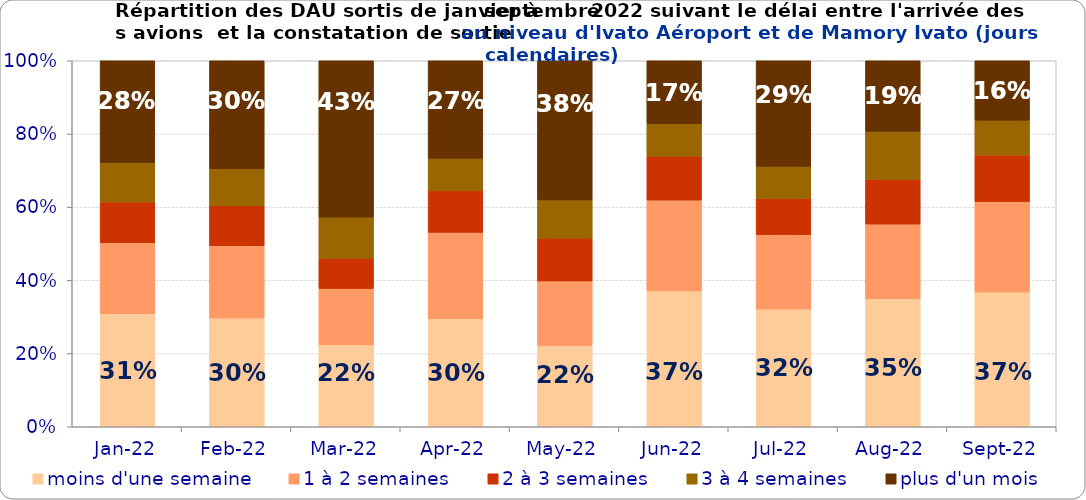
| Category | moins d'une semaine | 1 à 2 semaines | 2 à 3 semaines | 3 à 4 semaines | plus d'un mois |
|---|---|---|---|---|---|
| 2022-01-01 | 0.309 | 0.194 | 0.112 | 0.108 | 0.278 |
| 2022-02-01 | 0.297 | 0.197 | 0.109 | 0.101 | 0.295 |
| 2022-03-01 | 0.224 | 0.154 | 0.082 | 0.113 | 0.427 |
| 2022-04-01 | 0.295 | 0.236 | 0.114 | 0.089 | 0.266 |
| 2022-05-01 | 0.222 | 0.177 | 0.117 | 0.105 | 0.38 |
| 2022-06-01 | 0.371 | 0.248 | 0.12 | 0.089 | 0.172 |
| 2022-07-01 | 0.322 | 0.204 | 0.098 | 0.088 | 0.288 |
| 2022-08-01 | 0.35 | 0.204 | 0.122 | 0.132 | 0.193 |
| 2022-09-01 | 0.368 | 0.247 | 0.127 | 0.095 | 0.162 |